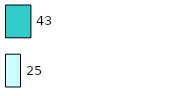
| Category | Series 0 | Series 1 |
|---|---|---|
| 0 | 25 | 43 |